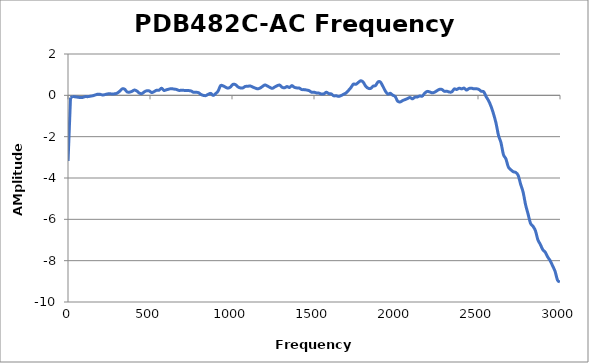
| Category | Series 0 |
|---|---|
| 0.3 | -3.179 |
| 15.2985 | -0.111 |
| 30.297 | -0.055 |
| 45.2955 | -0.073 |
| 60.294 | -0.091 |
| 75.2925 | -0.109 |
| 90.291 | -0.099 |
| 105.289 | -0.061 |
| 120.288 | -0.064 |
| 135.287 | -0.041 |
| 150.285 | -0.022 |
| 165.284 | 0.014 |
| 180.282 | 0.054 |
| 195.281 | 0.049 |
| 210.279 | 0.018 |
| 225.278 | 0.035 |
| 240.276 | 0.068 |
| 255.274 | 0.074 |
| 270.273 | 0.066 |
| 285.272 | 0.074 |
| 300.27 | 0.109 |
| 315.269 | 0.2 |
| 330.267 | 0.312 |
| 345.266 | 0.297 |
| 360.264 | 0.166 |
| 375.263 | 0.155 |
| 390.261 | 0.194 |
| 405.26 | 0.256 |
| 420.258 | 0.206 |
| 435.257 | 0.108 |
| 450.255 | 0.084 |
| 465.254 | 0.168 |
| 480.252 | 0.222 |
| 495.251 | 0.214 |
| 510.249 | 0.135 |
| 525.248 | 0.182 |
| 540.246 | 0.247 |
| 555.245 | 0.249 |
| 570.243 | 0.344 |
| 585.242 | 0.236 |
| 600.24 | 0.268 |
| 615.239 | 0.3 |
| 630.237 | 0.324 |
| 645.236 | 0.303 |
| 660.234 | 0.287 |
| 675.233 | 0.241 |
| 690.231 | 0.243 |
| 705.23 | 0.241 |
| 720.228 | 0.232 |
| 735.227 | 0.231 |
| 750.225 | 0.211 |
| 765.224 | 0.148 |
| 780.222 | 0.149 |
| 795.221 | 0.13 |
| 810.219 | 0.046 |
| 825.217 | -0.003 |
| 840.216 | -0.013 |
| 855.215 | 0.052 |
| 870.213 | 0.094 |
| 885.212 | -0.004 |
| 900.21 | 0.082 |
| 915.209 | 0.207 |
| 930.207 | 0.466 |
| 945.206 | 0.458 |
| 960.204 | 0.397 |
| 975.203 | 0.347 |
| 990.201 | 0.401 |
| 1005.2 | 0.529 |
| 1020.2 | 0.521 |
| 1035.2 | 0.416 |
| 1050.2 | 0.36 |
| 1065.19 | 0.355 |
| 1080.19 | 0.428 |
| 1095.19 | 0.434 |
| 1110.19 | 0.455 |
| 1125.19 | 0.404 |
| 1140.19 | 0.355 |
| 1155.19 | 0.317 |
| 1170.18 | 0.346 |
| 1185.18 | 0.425 |
| 1200.18 | 0.503 |
| 1215.18 | 0.454 |
| 1230.18 | 0.389 |
| 1245.18 | 0.337 |
| 1260.17 | 0.401 |
| 1275.17 | 0.463 |
| 1290.17 | 0.496 |
| 1305.17 | 0.393 |
| 1320.17 | 0.363 |
| 1335.17 | 0.425 |
| 1350.17 | 0.379 |
| 1365.16 | 0.471 |
| 1380.16 | 0.388 |
| 1395.16 | 0.36 |
| 1410.16 | 0.353 |
| 1425.16 | 0.281 |
| 1440.16 | 0.276 |
| 1455.16 | 0.256 |
| 1470.15 | 0.227 |
| 1485.15 | 0.152 |
| 1500.15 | 0.151 |
| 1515.15 | 0.116 |
| 1530.15 | 0.106 |
| 1545.15 | 0.063 |
| 1560.14 | 0.071 |
| 1575.14 | 0.15 |
| 1590.14 | 0.086 |
| 1605.14 | 0.069 |
| 1620.14 | -0.023 |
| 1635.14 | -0.019 |
| 1650.14 | -0.051 |
| 1665.13 | -0.012 |
| 1680.13 | 0.049 |
| 1695.13 | 0.113 |
| 1710.13 | 0.236 |
| 1725.13 | 0.374 |
| 1740.13 | 0.541 |
| 1755.12 | 0.533 |
| 1770.12 | 0.622 |
| 1785.12 | 0.706 |
| 1800.12 | 0.639 |
| 1815.12 | 0.44 |
| 1830.12 | 0.344 |
| 1845.12 | 0.332 |
| 1860.11 | 0.444 |
| 1875.11 | 0.471 |
| 1890.11 | 0.647 |
| 1905.11 | 0.641 |
| 1920.11 | 0.436 |
| 1935.11 | 0.207 |
| 1950.11 | 0.059 |
| 1965.1 | 0.098 |
| 1980.1 | 0.007 |
| 1995.1 | -0.059 |
| 2010.1 | -0.281 |
| 2025.1 | -0.322 |
| 2040.1 | -0.253 |
| 2055.1 | -0.207 |
| 2070.09 | -0.157 |
| 2085.09 | -0.105 |
| 2100.09 | -0.17 |
| 2115.09 | -0.091 |
| 2130.09 | -0.08 |
| 2145.09 | -0.029 |
| 2160.08 | -0.039 |
| 2175.08 | 0.106 |
| 2190.08 | 0.19 |
| 2205.08 | 0.166 |
| 2220.08 | 0.122 |
| 2235.08 | 0.15 |
| 2250.08 | 0.225 |
| 2265.07 | 0.29 |
| 2280.07 | 0.283 |
| 2295.07 | 0.195 |
| 2310.07 | 0.198 |
| 2325.07 | 0.161 |
| 2340.07 | 0.166 |
| 2355.07 | 0.31 |
| 2370.06 | 0.284 |
| 2385.06 | 0.344 |
| 2400.06 | 0.312 |
| 2415.06 | 0.35 |
| 2430.06 | 0.254 |
| 2445.06 | 0.33 |
| 2460.05 | 0.344 |
| 2475.05 | 0.313 |
| 2490.05 | 0.321 |
| 2505.05 | 0.286 |
| 2520.05 | 0.196 |
| 2535.05 | 0.171 |
| 2550.05 | -0.07 |
| 2565.04 | -0.268 |
| 2580.04 | -0.545 |
| 2595.04 | -0.907 |
| 2610.04 | -1.35 |
| 2625.04 | -1.94 |
| 2640.04 | -2.288 |
| 2655.04 | -2.867 |
| 2670.03 | -3.073 |
| 2685.03 | -3.467 |
| 2700.03 | -3.6 |
| 2715.03 | -3.697 |
| 2730.03 | -3.731 |
| 2745.03 | -3.875 |
| 2760.02 | -4.304 |
| 2775.02 | -4.684 |
| 2790.02 | -5.289 |
| 2805.02 | -5.735 |
| 2820.02 | -6.19 |
| 2835.02 | -6.33 |
| 2850.02 | -6.548 |
| 2865.01 | -6.987 |
| 2880.01 | -7.212 |
| 2895.01 | -7.468 |
| 2910.01 | -7.589 |
| 2925.01 | -7.824 |
| 2940.01 | -7.997 |
| 2955.0 | -8.253 |
| 2970.0 | -8.516 |
| 2985.0 | -8.946 |
| 3000.0 | -9.031 |